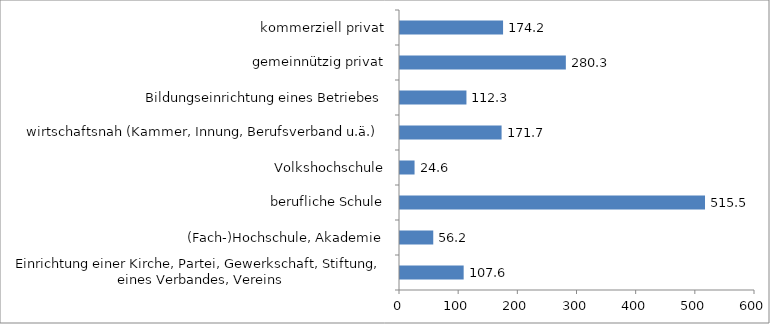
| Category | Series 0 |
|---|---|
| Einrichtung einer Kirche, Partei, Gewerkschaft, Stiftung, eines Verbandes, Vereins | 107.6 |
| (Fach-)Hochschule, Akademie | 56.2 |
| berufliche Schule | 515.5 |
| Volkshochschule | 24.6 |
| wirtschaftsnah (Kammer, Innung, Berufsverband u.ä.) | 171.7 |
| Bildungseinrichtung eines Betriebes | 112.3 |
| gemeinnützig privat | 280.3 |
| kommerziell privat | 174.2 |